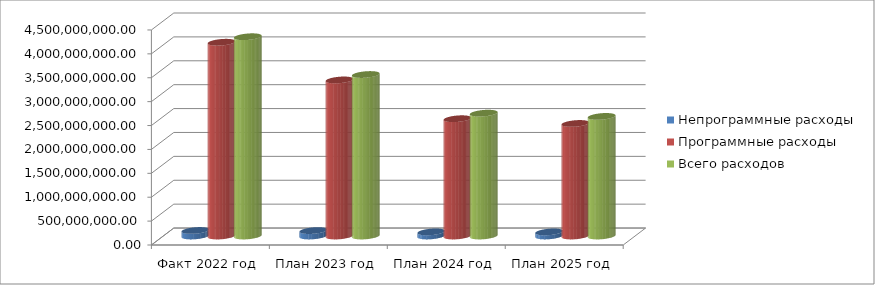
| Category | Непрограммные расходы | Программные расходы | Всего расходов |
|---|---|---|---|
| Факт 2022 год | 115508141.48 | 4054430113.57 | 4169938255.05 |
| План 2023 год | 113525575 | 3265830815 | 3379356390 |
| План 2024 год | 85685960 | 2454213540 | 2570199500 |
| План 2025 год | 85212458 | 2354851592 | 2502364050 |